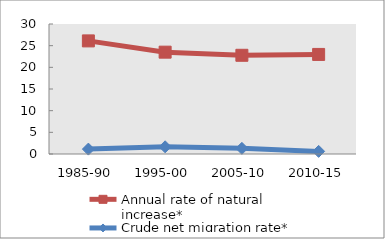
| Category | Annual rate of natural increase* | Crude net migration rate* |
|---|---|---|
| 1985-90 | 26.102 | 1.128 |
| 1995-00 | 23.501 | 1.659 |
| 2005-10 | 22.781 | 1.303 |
| 2010-15 | 22.976 | 0.605 |